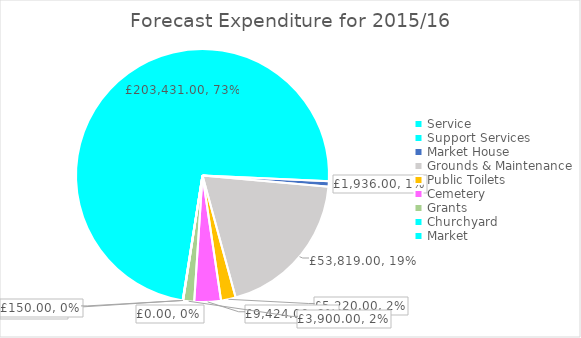
| Category | Series 0 | Series 1 | Series 2 |
|---|---|---|---|
| Service | 0 |  |  |
| Support Services | 203431 |  |  |
| Market House | 1936 |  |  |
| Grounds & Maintenance | 53819 |  |  |
| Public Toilets | 5220 |  |  |
| Cemetery | 9424 |  |  |
| Grants | 3900 |  |  |
| Churchyard | 0 |  |  |
| Market   | 150 |  |  |